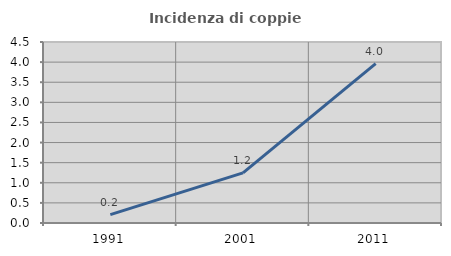
| Category | Incidenza di coppie miste |
|---|---|
| 1991.0 | 0.208 |
| 2001.0 | 1.246 |
| 2011.0 | 3.96 |